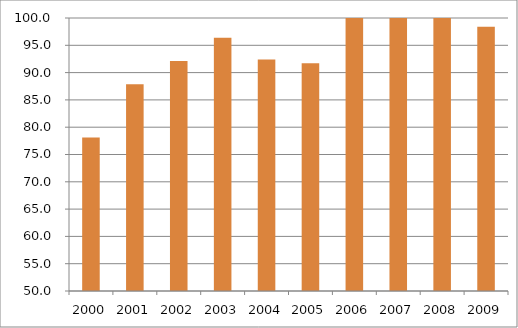
| Category | Região Norte |
|---|---|
| 2000.0 | 78.13 |
| 2001.0 | 87.85 |
| 2002.0 | 92.14 |
| 2003.0 | 96.39 |
| 2004.0 | 92.38 |
| 2005.0 | 91.69 |
| 2006.0 | 104.06 |
| 2007.0 | 105.21 |
| 2008.0 | 100.2 |
| 2009.0 | 98.41 |